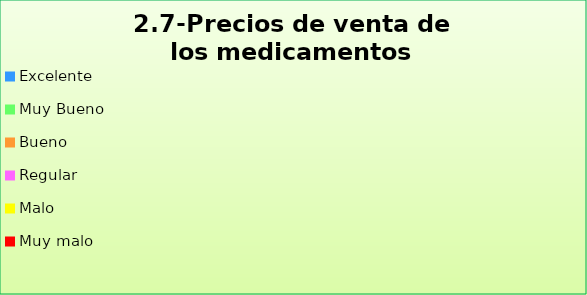
| Category | Series 0 |
|---|---|
| Excelente | 0.741 |
| Muy Bueno | 0.17 |
| Bueno  | 0.063 |
| Regular  | 0.02 |
| Malo  | 0.006 |
| Muy malo  | 0 |